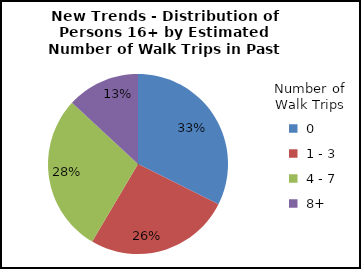
| Category | Series 0 |
|---|---|
|  0 | 32.4 |
|  1 - 3 | 26.1 |
|  4 - 7 | 28.4 |
|  8+ | 13.1 |